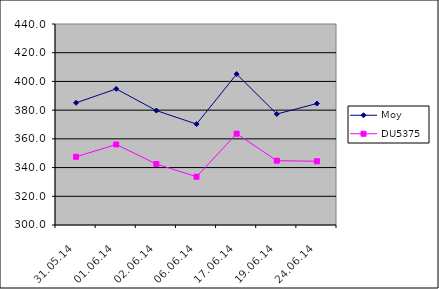
| Category | Moy | DU5375 |
|---|---|---|
| 31.05.14 | 385.1 | 347.5 |
| 01.06.14 | 394.8 | 356.1 |
| 02.06.14 | 379.7 | 342.5 |
| 06.06.14 | 370.3 | 333.6 |
| 17.06.14 | 405.1 | 363.6 |
| 19.06.14 | 377.3 | 344.8 |
| 24.06.14 | 384.6 | 344.4 |